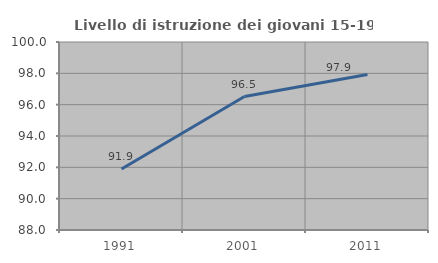
| Category | Livello di istruzione dei giovani 15-19 anni |
|---|---|
| 1991.0 | 91.892 |
| 2001.0 | 96.517 |
| 2011.0 | 97.927 |